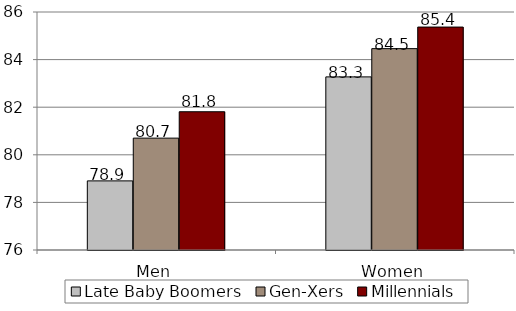
| Category | Late Baby Boomers | Gen-Xers | Millennials |
|---|---|---|---|
| Men | 78.904 | 80.701 | 81.809 |
| Women | 83.274 | 84.461 | 85.367 |